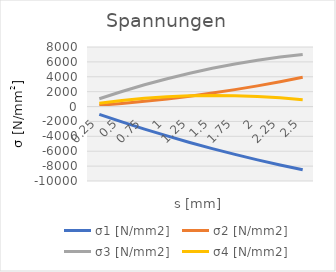
| Category | σ1 [N/mm2]  | σ2 [N/mm2]  | σ3 [N/mm2]  | σ4 [N/mm2]  |
|---|---|---|---|---|
| 0.25 | -1055.215 | 187.647 | 1053.806 | 446.184 |
| 0.5 | -2064.769 | 420.955 | 2028.665 | 813.422 |
| 0.75 | -3028.662 | 699.925 | 2924.577 | 1101.713 |
| 1.0 | -3946.893 | 1024.556 | 3741.542 | 1311.056 |
| 1.25 | -4819.462 | 1394.849 | 4479.561 | 1441.453 |
| 1.5 | -5646.37 | 1810.804 | 5138.633 | 1492.903 |
| 1.75 | -6427.616 | 2272.419 | 5718.757 | 1465.407 |
| 2.0 | -7163.201 | 2779.697 | 6219.935 | 1358.963 |
| 2.25 | -7853.124 | 3332.636 | 6642.166 | 1173.572 |
| 2.5 | -8497.386 | 3931.236 | 6985.45 | 909.235 |